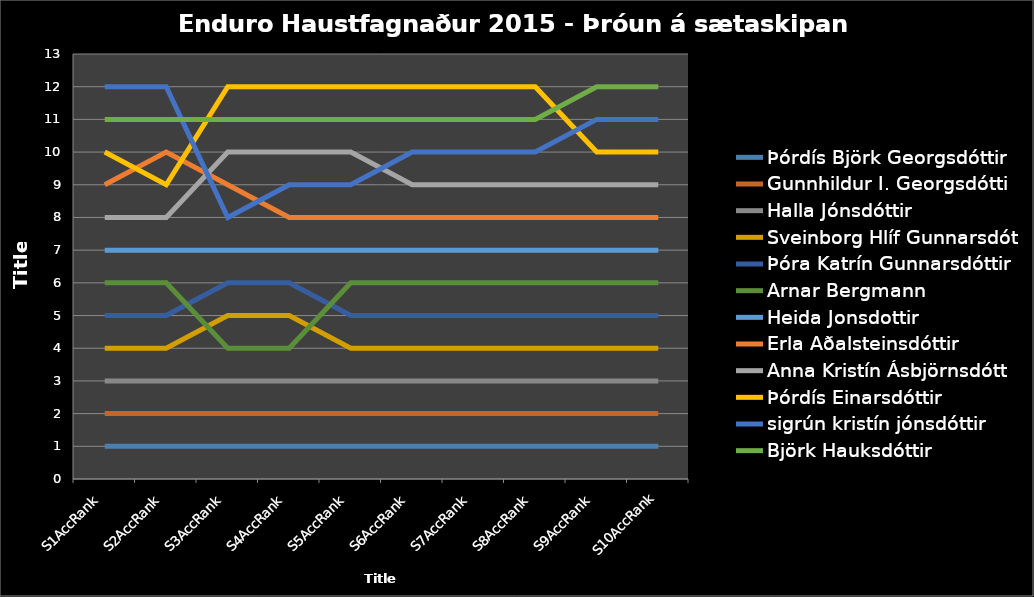
| Category | Þórdís Björk Georgsdóttir | Gunnhildur I. Georgsdótti | Halla Jónsdóttir  | Sveinborg Hlíf Gunnarsdót | Þóra Katrín Gunnarsdóttir | Arnar Bergmann  | Heida Jonsdottir  | Erla Aðalsteinsdóttir  | Anna Kristín Ásbjörnsdótt | Þórdís Einarsdóttir  | sigrún kristín jónsdóttir | Björk Hauksdóttir  |
|---|---|---|---|---|---|---|---|---|---|---|---|---|
| S1AccRank | 1 | 2 | 3 | 4 | 5 | 6 | 7 | 9 | 8 | 10 | 12 | 11 |
| S2AccRank | 1 | 2 | 3 | 4 | 5 | 6 | 7 | 10 | 8 | 9 | 12 | 11 |
| S3AccRank | 1 | 2 | 3 | 5 | 6 | 4 | 7 | 9 | 10 | 12 | 8 | 11 |
| S4AccRank | 1 | 2 | 3 | 5 | 6 | 4 | 7 | 8 | 10 | 12 | 9 | 11 |
| S5AccRank | 1 | 2 | 3 | 4 | 5 | 6 | 7 | 8 | 10 | 12 | 9 | 11 |
| S6AccRank | 1 | 2 | 3 | 4 | 5 | 6 | 7 | 8 | 9 | 12 | 10 | 11 |
| S7AccRank | 1 | 2 | 3 | 4 | 5 | 6 | 7 | 8 | 9 | 12 | 10 | 11 |
| S8AccRank | 1 | 2 | 3 | 4 | 5 | 6 | 7 | 8 | 9 | 12 | 10 | 11 |
| S9AccRank | 1 | 2 | 3 | 4 | 5 | 6 | 7 | 8 | 9 | 10 | 11 | 12 |
| S10AccRank | 1 | 2 | 3 | 4 | 5 | 6 | 7 | 8 | 9 | 10 | 11 | 12 |